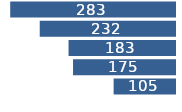
| Category | Series 0 |
|---|---|
|  Ohio  | 282.5 |
|  Illinois  | 231.9 |
|  Indiana  | 182.5 |
|  Michigan  | 174.8 |
|  Wisconsin  | 105.2 |